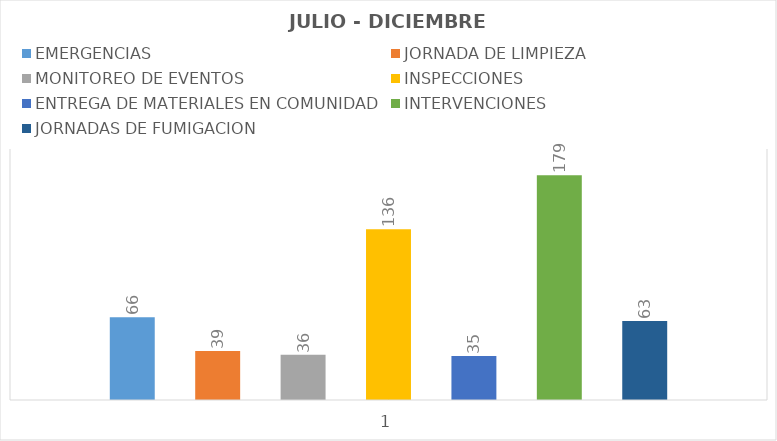
| Category | EMERGENCIAS  | JORNADA DE LIMPIEZA | MONITOREO DE EVENTOS  | INSPECCIONES | ENTREGA DE MATERIALES EN COMUNIDAD | INTERVENCIONES | JORNADAS DE FUMIGACION |
|---|---|---|---|---|---|---|---|
| 0 | 66 | 39 | 36 | 136 | 35 | 179 | 63 |